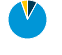
| Category | Series 0 |
|---|---|
| Electricity | 0.079 |
| Natural Gas | 0.867 |
| Distillate Fuel Oil | 0.054 |